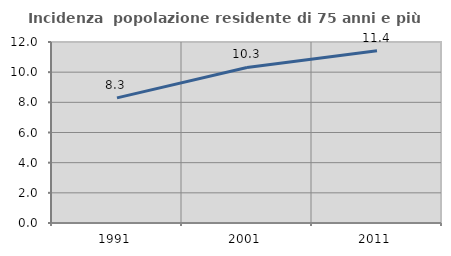
| Category | Incidenza  popolazione residente di 75 anni e più |
|---|---|
| 1991.0 | 8.298 |
| 2001.0 | 10.313 |
| 2011.0 | 11.42 |